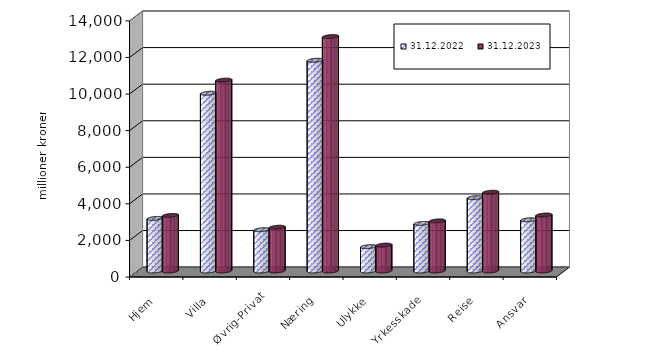
| Category | 31.12.2022 | 31.12.2023 |
|---|---|---|
| Hjem | 2875.511 | 3037.868 |
| Villa | 9717.52 | 10432.685 |
| Øvrig-Privat | 2256.018 | 2393.402 |
| Næring | 11520.533 | 12816.147 |
| Ulykke | 1331.244 | 1416.213 |
| Yrkesskade | 2600.673 | 2739.923 |
| Reise | 4010.609 | 4305.087 |
| Ansvar | 2800.867 | 3059.406 |